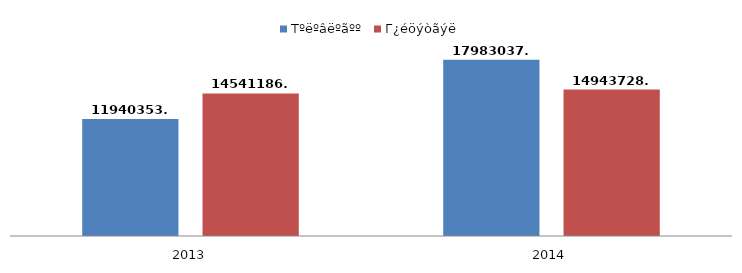
| Category | Тºëºâëºãºº | Г¿éöýòãýë |
|---|---|---|
| 2013.0 | 11940353.4 | 14541186.5 |
| 2014.0 | 17983037.6 | 14943728.2 |